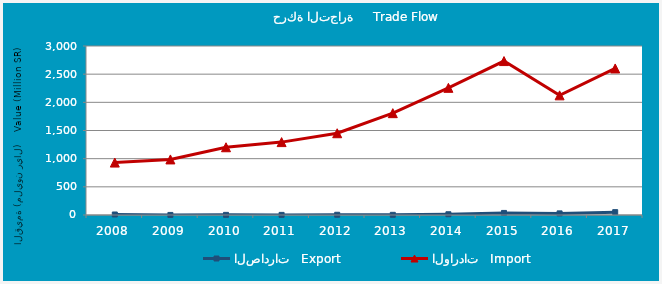
| Category | الصادرات   Export | الواردات   Import |
|---|---|---|
| 2008.0 | 9013368 | 930606772 |
| 2009.0 | 1315257 | 986492463 |
| 2010.0 | 2459319 | 1202656334 |
| 2011.0 | 2113955 | 1293961497 |
| 2012.0 | 4423342 | 1451208981 |
| 2013.0 | 3193641 | 1807615404 |
| 2014.0 | 13449745 | 2257369487 |
| 2015.0 | 36644808 | 2732469288 |
| 2016.0 | 28573209 | 2123836111 |
| 2017.0 | 50631808 | 2601681419 |